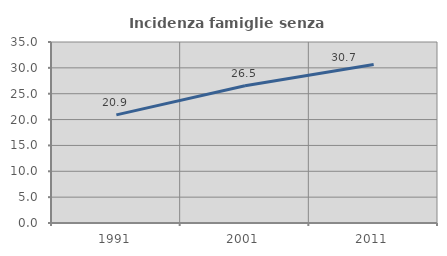
| Category | Incidenza famiglie senza nuclei |
|---|---|
| 1991.0 | 20.901 |
| 2001.0 | 26.547 |
| 2011.0 | 30.66 |